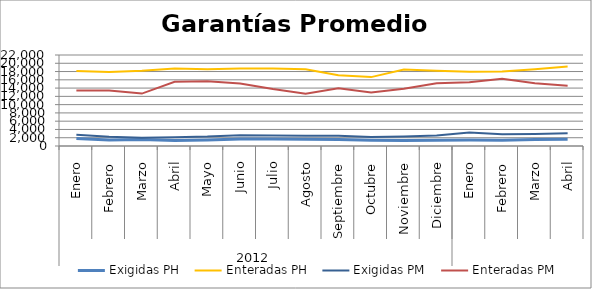
| Category | Exigidas PH | Enteradas PH | Exigidas PM | Enteradas PM |
|---|---|---|---|---|
| 0 | 1828.564 | 18155.583 | 2744.93 | 13413.991 |
| 1 | 1451.155 | 17917.734 | 2215.902 | 13440.832 |
| 2 | 1587.31 | 18166.129 | 1968.766 | 12673.714 |
| 3 | 1353.003 | 18741.256 | 2118.782 | 15515.723 |
| 4 | 1464.668 | 18540.927 | 2278.002 | 15625.393 |
| 5 | 1719.43 | 18734.539 | 2626.915 | 15127.903 |
| 6 | 1674.023 | 18761.463 | 2556.575 | 13766.49 |
| 7 | 1647.243 | 18544.546 | 2463.76 | 12637.427 |
| 8 | 1556.152 | 17124.972 | 2459.803 | 13929.715 |
| 9 | 1402.926 | 16653.067 | 2169.047 | 12937.81 |
| 10 | 1329.011 | 18467.462 | 2322.009 | 13825.53 |
| 11 | 1379.519 | 18204.98 | 2522.413 | 15188.776 |
| 12 | 1462.675 | 17957.148 | 3246.817 | 15415.235 |
| 13 | 1398.609 | 17993.637 | 2845.352 | 16230.589 |
| 14 | 1589.589 | 18548.479 | 2894.834 | 15192.36 |
| 15 | 1623.519 | 19220.98 | 3086.854 | 14555.102 |